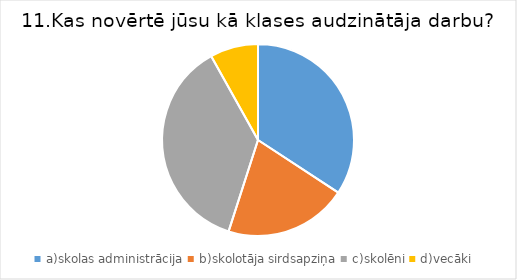
| Category | Series 0 |
|---|---|
| a)skolas administrācija | 0.792 |
| b)skolotāja sirdsapziņa | 0.479 |
| c)skolēni | 0.854 |
| d)vecāki | 0.188 |